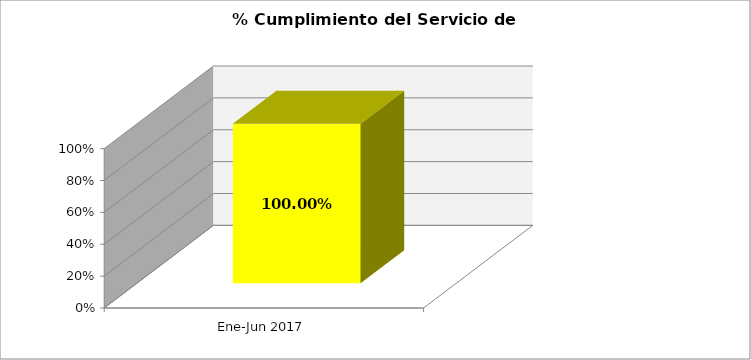
| Category | % |
|---|---|
| Ene-Jun 2017 | 1 |